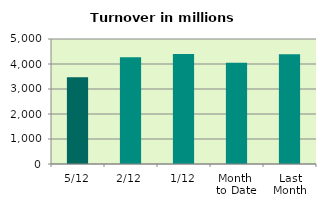
| Category | Series 0 |
|---|---|
| 5/12 | 3474.657 |
| 2/12 | 4268.401 |
| 1/12 | 4404.469 |
| Month 
to Date | 4049.176 |
| Last
Month | 4388.555 |